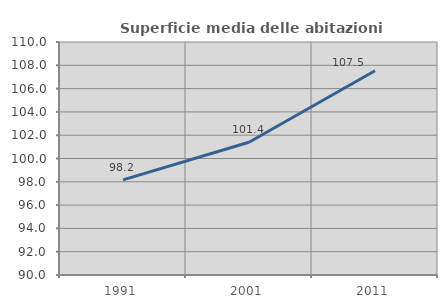
| Category | Superficie media delle abitazioni occupate |
|---|---|
| 1991.0 | 98.162 |
| 2001.0 | 101.395 |
| 2011.0 | 107.526 |